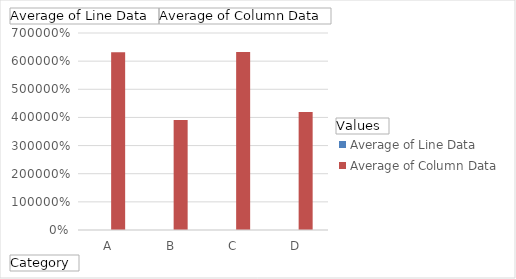
| Category | Average of Line Data | Average of Column Data |
|---|---|---|
| A | 0.543 | 6317.556 |
| B | 0.422 | 3909.143 |
| C | 0.711 | 6327.444 |
| D | 0.672 | 4191.167 |